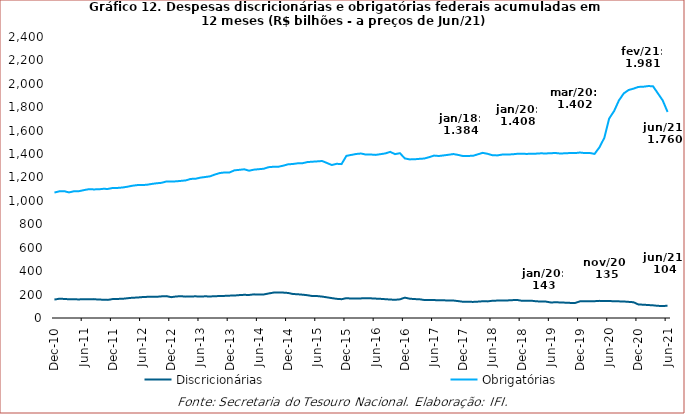
| Category | Discricionárias | Obrigatórias |
|---|---|---|
| 2010-12-01 | 157467.208 | 1071541.826 |
| 2011-01-01 | 164572.083 | 1081746.922 |
| 2011-02-01 | 162934.795 | 1083327.632 |
| 2011-03-01 | 159895.166 | 1072624.014 |
| 2011-04-01 | 160333.247 | 1082328.143 |
| 2011-05-01 | 158541.882 | 1082726.62 |
| 2011-06-01 | 160784.72 | 1091669.191 |
| 2011-07-01 | 159242.793 | 1099748.575 |
| 2011-08-01 | 161220.237 | 1098497.571 |
| 2011-09-01 | 157571.433 | 1098651.153 |
| 2011-10-01 | 156526.347 | 1103163.104 |
| 2011-11-01 | 154740.922 | 1102524.815 |
| 2011-12-01 | 162071.094 | 1110841.543 |
| 2012-01-01 | 163071.064 | 1111026.57 |
| 2012-02-01 | 164063.254 | 1114644.69 |
| 2012-03-01 | 168698.017 | 1121125.114 |
| 2012-04-01 | 173088.25 | 1129497.394 |
| 2012-05-01 | 174602.723 | 1134950.001 |
| 2012-06-01 | 178413.702 | 1135330.057 |
| 2012-07-01 | 180531.923 | 1138028.926 |
| 2012-08-01 | 181536.876 | 1145050.227 |
| 2012-09-01 | 181201.629 | 1150674.659 |
| 2012-10-01 | 184756.871 | 1154547.637 |
| 2012-11-01 | 186845.424 | 1165772.641 |
| 2012-12-01 | 177958.353 | 1165848.594 |
| 2013-01-01 | 183943.961 | 1167138.63 |
| 2013-02-01 | 186080.537 | 1171135.452 |
| 2013-03-01 | 182510.352 | 1175222.438 |
| 2013-04-01 | 183925.212 | 1187903.075 |
| 2013-05-01 | 185019.51 | 1189257.344 |
| 2013-06-01 | 183248.471 | 1198830.885 |
| 2013-07-01 | 185154.163 | 1204183.42 |
| 2013-08-01 | 183901.121 | 1210351.99 |
| 2013-09-01 | 186313.958 | 1225667.031 |
| 2013-10-01 | 187385.588 | 1238304.516 |
| 2013-11-01 | 188897.781 | 1243157.369 |
| 2013-12-01 | 191001.905 | 1243514.669 |
| 2014-01-01 | 191818.4 | 1261281.37 |
| 2014-02-01 | 195543.245 | 1265421.742 |
| 2014-03-01 | 197963.161 | 1270109.224 |
| 2014-04-01 | 196738.5 | 1258111.498 |
| 2014-05-01 | 201931.013 | 1267023.066 |
| 2014-06-01 | 200139.507 | 1270980.298 |
| 2014-07-01 | 200800.435 | 1274764.536 |
| 2014-08-01 | 209335.491 | 1287991.586 |
| 2014-09-01 | 216740.961 | 1291700.817 |
| 2014-10-01 | 217318.822 | 1291882.264 |
| 2014-11-01 | 217007.337 | 1300627.352 |
| 2014-12-01 | 213970.231 | 1312483.067 |
| 2015-01-01 | 205160.498 | 1315418.902 |
| 2015-02-01 | 202670.917 | 1321167.335 |
| 2015-03-01 | 199112.295 | 1322140.225 |
| 2015-04-01 | 194562.064 | 1331883.355 |
| 2015-05-01 | 187707.118 | 1334846.774 |
| 2015-06-01 | 187292.351 | 1337653.922 |
| 2015-07-01 | 182931.708 | 1340867.552 |
| 2015-08-01 | 176549.525 | 1324051.978 |
| 2015-09-01 | 169854.688 | 1306525.828 |
| 2015-10-01 | 163758.944 | 1317138.949 |
| 2015-11-01 | 160646.239 | 1314416.883 |
| 2015-12-01 | 169357.677 | 1384957.748 |
| 2016-01-01 | 166242.38 | 1392801.969 |
| 2016-02-01 | 167315.227 | 1400822.393 |
| 2016-03-01 | 167440.186 | 1404842.51 |
| 2016-04-01 | 169653.32 | 1395701.55 |
| 2016-05-01 | 168033.665 | 1396434.009 |
| 2016-06-01 | 165683.914 | 1393041.406 |
| 2016-07-01 | 163694.252 | 1399276.244 |
| 2016-08-01 | 160728.815 | 1405651.765 |
| 2016-09-01 | 157698.308 | 1419038.005 |
| 2016-10-01 | 155563.473 | 1399487.926 |
| 2016-11-01 | 159350.21 | 1407765.318 |
| 2016-12-01 | 173916.807 | 1363008.62 |
| 2017-01-01 | 165011.901 | 1354572.379 |
| 2017-02-01 | 161494.951 | 1355743.179 |
| 2017-03-01 | 160243.964 | 1359205.316 |
| 2017-04-01 | 153813.621 | 1362018.903 |
| 2017-05-01 | 154734.712 | 1373585.319 |
| 2017-06-01 | 153310.443 | 1387167.655 |
| 2017-07-01 | 151013.549 | 1383768.254 |
| 2017-08-01 | 150769.384 | 1388776.287 |
| 2017-09-01 | 149893.041 | 1394218.682 |
| 2017-10-01 | 149149.005 | 1400327.674 |
| 2017-11-01 | 144213.587 | 1392515.743 |
| 2017-12-01 | 138469.909 | 1382854.457 |
| 2018-01-01 | 138953.492 | 1384351.254 |
| 2018-02-01 | 137426.541 | 1385215.066 |
| 2018-03-01 | 139678.43 | 1397812.89 |
| 2018-04-01 | 142865.07 | 1410554.193 |
| 2018-05-01 | 141912.623 | 1402394.779 |
| 2018-06-01 | 147235.444 | 1390366.011 |
| 2018-07-01 | 148656.619 | 1388703.997 |
| 2018-08-01 | 148812.322 | 1395717.025 |
| 2018-09-01 | 149818.598 | 1396983.566 |
| 2018-10-01 | 152206.088 | 1397638.716 |
| 2018-11-01 | 154718.424 | 1401887.159 |
| 2018-12-01 | 147458.854 | 1403534.748 |
| 2019-01-01 | 146807.519 | 1401340.769 |
| 2019-02-01 | 147698.794 | 1403067.671 |
| 2019-03-01 | 142700.712 | 1403783.879 |
| 2019-04-01 | 140717.539 | 1406415.214 |
| 2019-05-01 | 140103.36 | 1405313.93 |
| 2019-06-01 | 132698.408 | 1407665.039 |
| 2019-07-01 | 134187.639 | 1408982.544 |
| 2019-08-01 | 132900.741 | 1404701.075 |
| 2019-09-01 | 130913.701 | 1407077.817 |
| 2019-10-01 | 129039.395 | 1408926.414 |
| 2019-11-01 | 128446.286 | 1408477.156 |
| 2019-12-01 | 142514.819 | 1413262.299 |
| 2020-01-01 | 143280.004 | 1408466.307 |
| 2020-02-01 | 142841.57 | 1409446.585 |
| 2020-03-01 | 143619.176 | 1401732.475 |
| 2020-04-01 | 146373.861 | 1457488.433 |
| 2020-05-01 | 144594.755 | 1538717.746 |
| 2020-06-01 | 145709.783 | 1703727.702 |
| 2020-07-01 | 142394.304 | 1766627.917 |
| 2020-08-01 | 142134.281 | 1857862.288 |
| 2020-09-01 | 140920.326 | 1918412.863 |
| 2020-10-01 | 137813.923 | 1947480.631 |
| 2020-11-01 | 134722.94 | 1958865.333 |
| 2020-12-01 | 115607.161 | 1973632.516 |
| 2021-01-01 | 113580.264 | 1975319.11 |
| 2021-02-01 | 110863.277 | 1980841.066 |
| 2021-03-01 | 108277.417 | 1979755.267 |
| 2021-04-01 | 103743.534 | 1919299.222 |
| 2021-05-01 | 102945.106 | 1858418.253 |
| 2021-06-01 | 104125.182 | 1759803.373 |